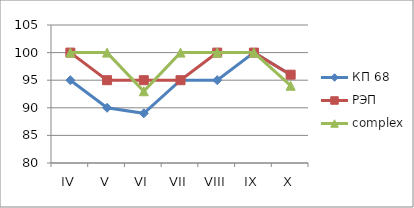
| Category | КП 68 | РЭП  | complex |
|---|---|---|---|
| IV | 95 | 100 | 100 |
| V | 90 | 95 | 100 |
| VI | 89 | 95 | 93 |
| VII | 95 | 95 | 100 |
| VIII | 95 | 100 | 100 |
| IX | 100 | 100 | 100 |
| X | 96 | 96 | 94 |